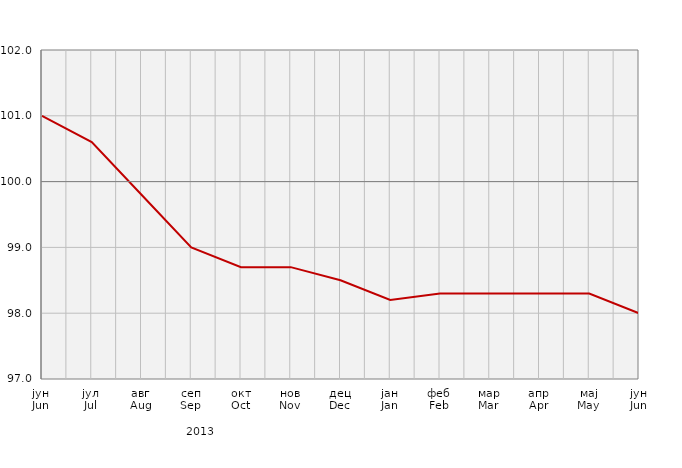
| Category | Индекси потрошачких цијена
Consumer price indices |
|---|---|
| јун
Jun | 101 |
| јул
Jul | 100.6 |
| авг
Aug | 99.8 |
| сеп
Sep | 99 |
| окт
Oct | 98.7 |
| нов
Nov | 98.7 |
| дец
Dec | 98.5 |
| јан
Jan | 98.2 |
| феб
Feb | 98.3 |
| мар
Mar | 98.3 |
| апр
Apr | 98.3 |
| мај
May | 98.3 |
| јун
Jun | 98 |